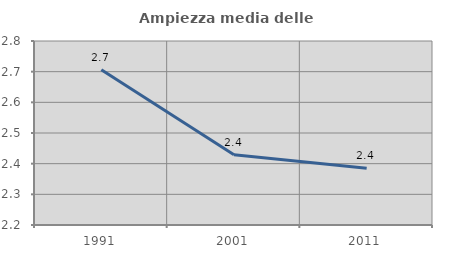
| Category | Ampiezza media delle famiglie |
|---|---|
| 1991.0 | 2.706 |
| 2001.0 | 2.429 |
| 2011.0 | 2.385 |